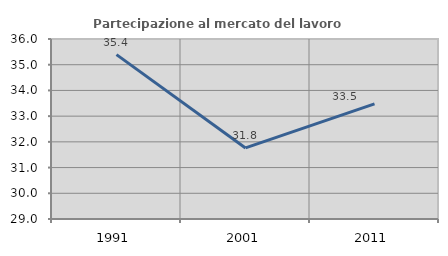
| Category | Partecipazione al mercato del lavoro  femminile |
|---|---|
| 1991.0 | 35.392 |
| 2001.0 | 31.763 |
| 2011.0 | 33.477 |